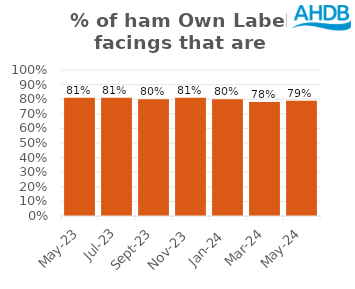
| Category | Ham |
|---|---|
| 2023-05-01 | 0.81 |
| 2023-07-01 | 0.81 |
| 2023-09-01 | 0.8 |
| 2023-11-01 | 0.81 |
| 2024-01-01 | 0.8 |
| 2024-03-01 | 0.78 |
| 2024-05-01 | 0.79 |